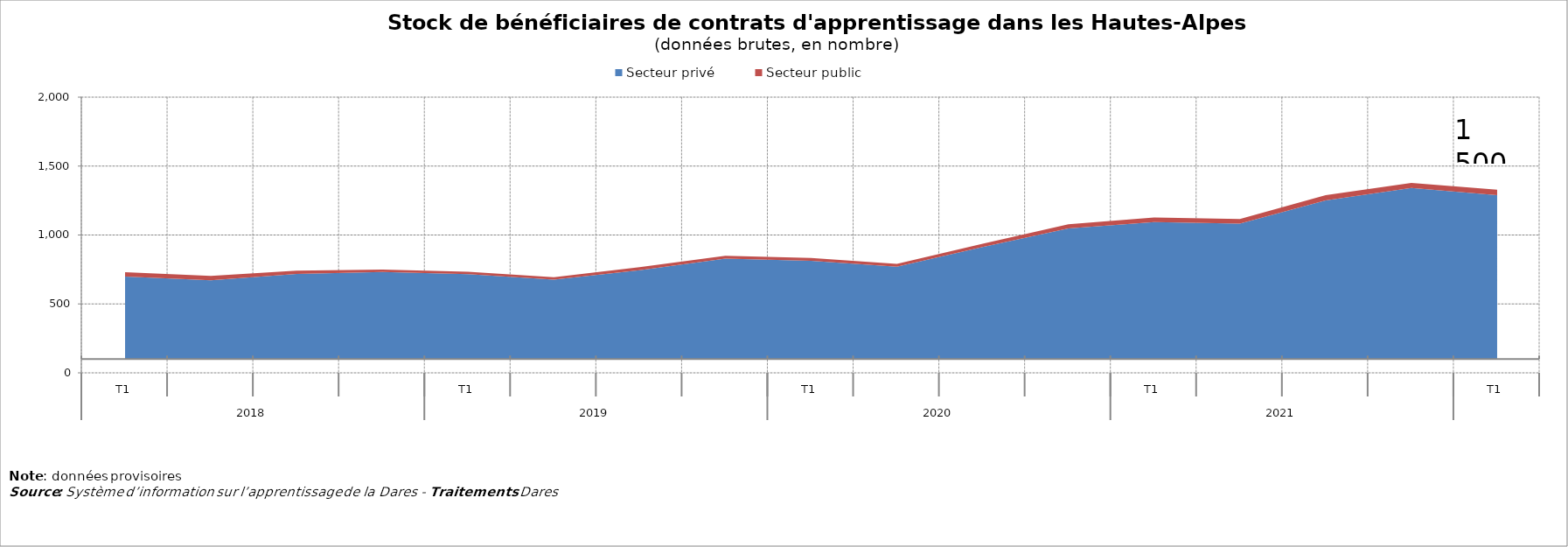
| Category | Secteur privé | Secteur public |
|---|---|---|
| 0 | 699 | 31 |
| 1 | 672 | 31 |
| 2 | 717 | 25 |
| 3 | 731 | 18 |
| 4 | 716 | 18 |
| 5 | 676 | 17 |
| 6 | 744 | 23 |
| 7 | 828 | 21 |
| 8 | 813 | 21 |
| 9 | 770 | 21 |
| 10 | 912 | 24 |
| 11 | 1047 | 31 |
| 12 | 1094 | 33 |
| 13 | 1083 | 33 |
| 14 | 1251 | 38 |
| 15 | 1341 | 37 |
| 16 | 1289 | 39 |